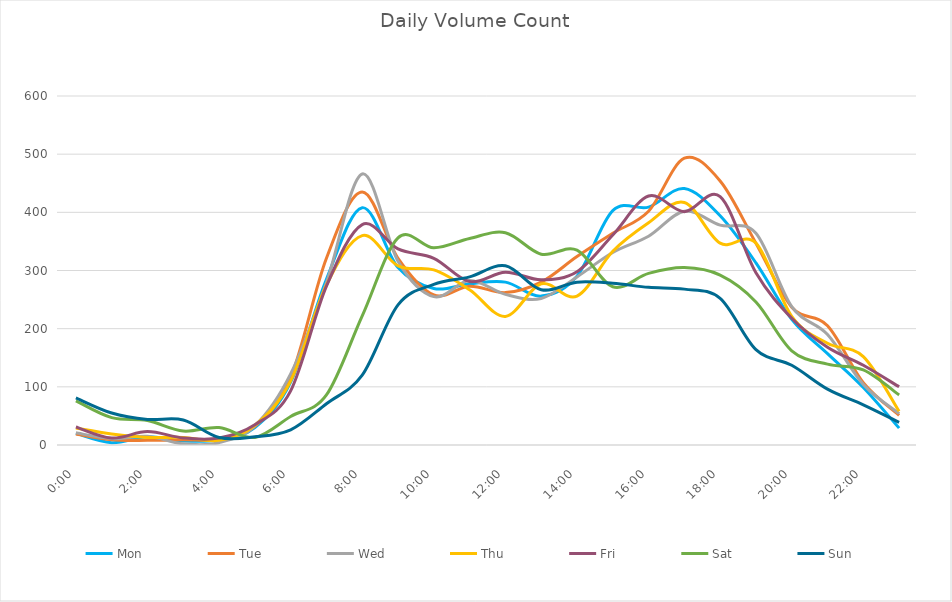
| Category | Mon | Tue | Wed | Thu | Fri | Sat | Sun |
|---|---|---|---|---|---|---|---|
| 0.0 | 20 | 19 | 21 | 29 | 31 | 76 | 81 |
| 0.0416666666666667 | 4 | 9 | 11 | 19 | 12 | 47 | 55 |
| 0.0833333333333333 | 14 | 8 | 15 | 13 | 23 | 42 | 44 |
| 0.125 | 7 | 9 | 2 | 13 | 12 | 24 | 43 |
| 0.166666666666667 | 9 | 10 | 4 | 8 | 12 | 30 | 13 |
| 0.208333333333333 | 30 | 32 | 33 | 34 | 35 | 13 | 14 |
| 0.25 | 108 | 116 | 122 | 110 | 93 | 49 | 26 |
| 0.291666666666667 | 285 | 321 | 279 | 275 | 273 | 86 | 71 |
| 0.333333333333333 | 408 | 435 | 466 | 360 | 379 | 222 | 120 |
| 0.375 | 305 | 321 | 316 | 308 | 337 | 356 | 241 |
| 0.416666666666667 | 269 | 258 | 255 | 301 | 321 | 339 | 276 |
| 0.4583333333333333 | 277 | 273 | 283 | 267 | 281 | 355 | 289 |
| 0.5 | 280 | 262 | 259 | 221 | 297 | 365 | 308 |
| 0.541666666666667 | 256 | 280 | 252 | 277 | 284 | 328 | 267 |
| 0.5833333333333334 | 290 | 324 | 289 | 256 | 298 | 335 | 280 |
| 0.625 | 403 | 364 | 331 | 333 | 361 | 272 | 278 |
| 0.666666666666667 | 409 | 402 | 359 | 382 | 428 | 295 | 271 |
| 0.7083333333333334 | 441 | 493 | 402 | 417 | 401 | 305 | 268 |
| 0.75 | 394 | 454 | 378 | 347 | 427 | 292 | 252 |
| 0.791666666666667 | 313 | 347 | 364 | 347 | 296 | 246 | 164 |
| 0.8333333333333334 | 216 | 237 | 238 | 221 | 218 | 162 | 137 |
| 0.875 | 157 | 205 | 190 | 175 | 168 | 139 | 96 |
| 0.916666666666667 | 99 | 107 | 104 | 152 | 137 | 129 | 69 |
| 0.9583333333333334 | 29 | 51 | 54 | 58 | 100 | 86 | 39 |